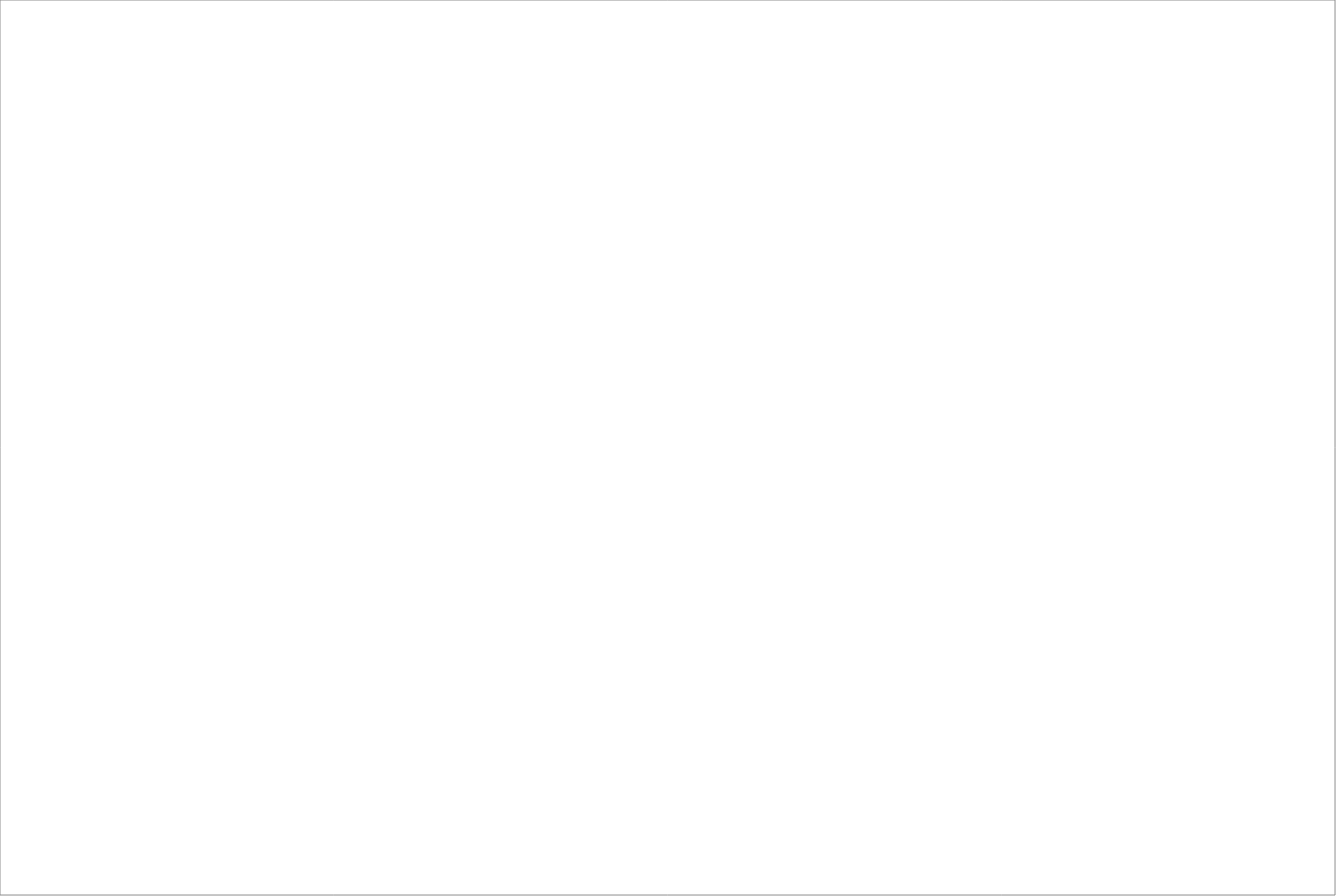
| Category | Total |
|---|---|
| Randstad AB | 74.175 |
| Poolia Sverige AB | 65 |
| StudentConsulting Sweden AB | 65 |
| Experis AB | 63.05 |
| Academic Work Sweden AB  | 62.5 |